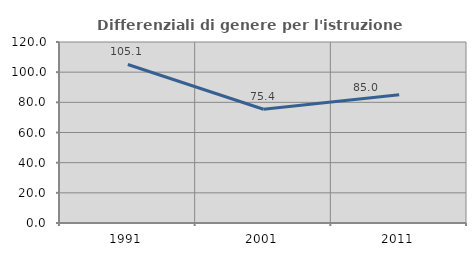
| Category | Differenziali di genere per l'istruzione superiore |
|---|---|
| 1991.0 | 105.087 |
| 2001.0 | 75.44 |
| 2011.0 | 85.046 |